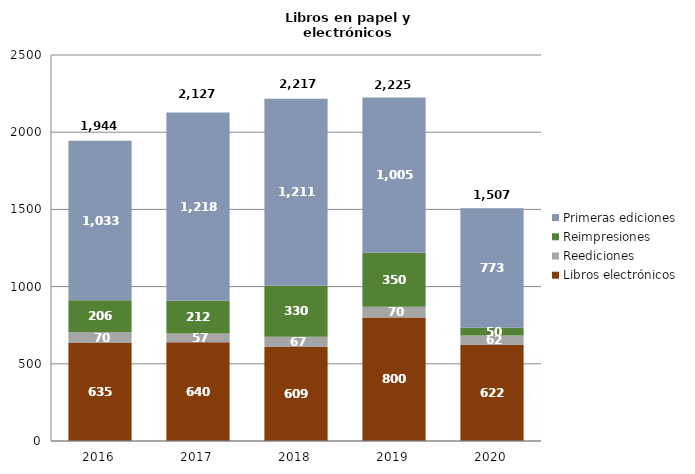
| Category | Libros electrónicos | Reediciones | Reimpresiones | Primeras ediciones |
|---|---|---|---|---|
| 2016.0 | 635 | 70 | 206 | 1033 |
| 2017.0 | 640 | 57 | 212 | 1218 |
| 2018.0 | 609 | 67 | 330 | 1211 |
| 2019.0 | 800 | 70 | 350 | 1005 |
| 2020.0 | 622 | 62 | 50 | 773 |